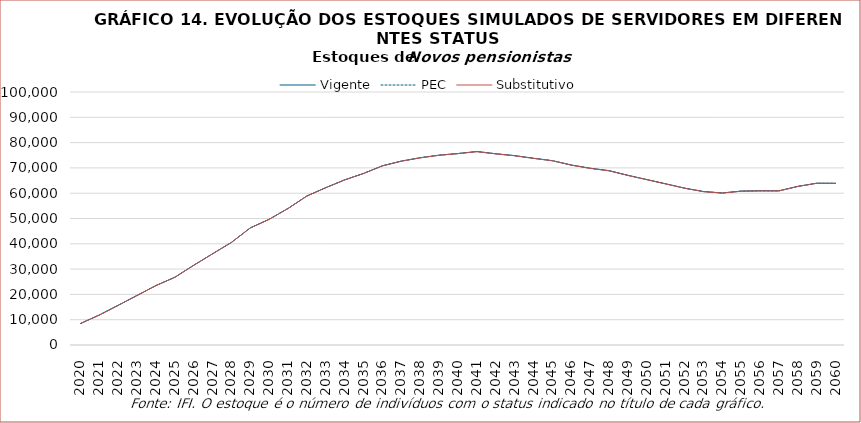
| Category | Vigente | PEC | Substitutivo |
|---|---|---|---|
| 2020.0 | 8487 | 8483 | 8477 |
| 2021.0 | 11851 | 11850 | 11843 |
| 2022.0 | 15694 | 15688 | 15685 |
| 2023.0 | 19588 | 19586 | 19578 |
| 2024.0 | 23489 | 23491 | 23479 |
| 2025.0 | 26776 | 26775 | 26765 |
| 2026.0 | 31512 | 31508 | 31494 |
| 2027.0 | 36055 | 36055 | 36034 |
| 2028.0 | 40558 | 40561 | 40538 |
| 2029.0 | 46293 | 46301 | 46270 |
| 2030.0 | 49698 | 49707 | 49666 |
| 2031.0 | 53982 | 53996 | 53959 |
| 2032.0 | 58908 | 58920 | 58882 |
| 2033.0 | 62201 | 62209 | 62171 |
| 2034.0 | 65281 | 65286 | 65247 |
| 2035.0 | 67819 | 67818 | 67782 |
| 2036.0 | 70832 | 70837 | 70799 |
| 2037.0 | 72681 | 72688 | 72643 |
| 2038.0 | 74009 | 74022 | 73973 |
| 2039.0 | 75021 | 75040 | 74985 |
| 2040.0 | 75669 | 75683 | 75635 |
| 2041.0 | 76462 | 76473 | 76418 |
| 2042.0 | 75582 | 75585 | 75538 |
| 2043.0 | 74840 | 74838 | 74792 |
| 2044.0 | 73803 | 73806 | 73762 |
| 2045.0 | 72851 | 72858 | 72808 |
| 2046.0 | 71131 | 71145 | 71088 |
| 2047.0 | 69863 | 69865 | 69800 |
| 2048.0 | 68900 | 68898 | 68846 |
| 2049.0 | 67076 | 67067 | 67030 |
| 2050.0 | 65386 | 65359 | 65342 |
| 2051.0 | 63716 | 63704 | 63679 |
| 2052.0 | 62011 | 61976 | 61957 |
| 2053.0 | 60675 | 60636 | 60614 |
| 2054.0 | 60093 | 60065 | 60042 |
| 2055.0 | 60841 | 60797 | 60788 |
| 2056.0 | 60970 | 60927 | 60901 |
| 2057.0 | 60950 | 60907 | 60902 |
| 2058.0 | 62707 | 62682 | 62666 |
| 2059.0 | 63940 | 63920 | 63904 |
| 2060.0 | 63928 | 63882 | 63893 |